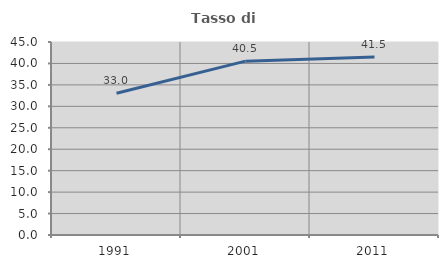
| Category | Tasso di occupazione   |
|---|---|
| 1991.0 | 33.033 |
| 2001.0 | 40.538 |
| 2011.0 | 41.522 |